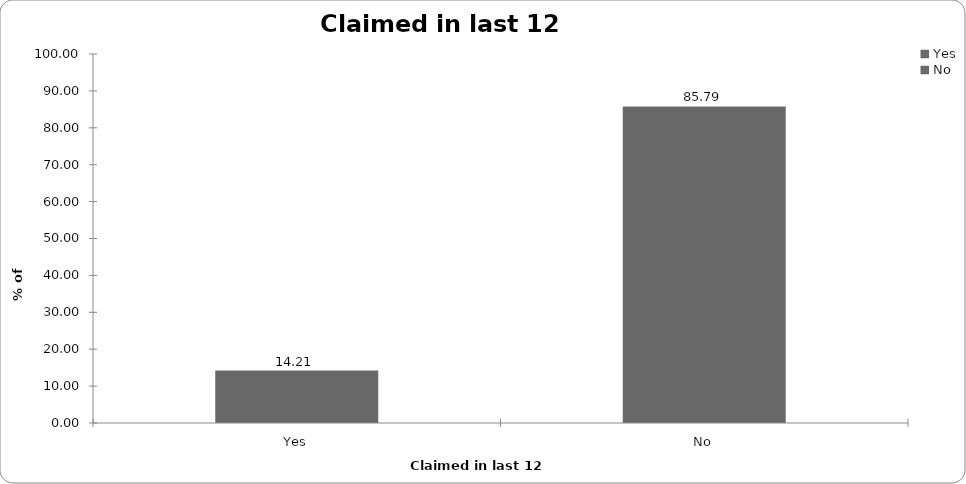
| Category | Claimed in last 12 months |
|---|---|
| Yes | 14.214 |
| No | 85.786 |